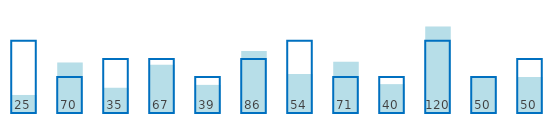
| Category | Valor real | Objetivo |
|---|---|---|
| Objetivo 1 | 25 | 100 |
| Objetivo2 | 70 | 50 |
| Objetivo 3 | 35 | 75 |
| Objetivo 4 | 67 | 75 |
| Objetivo 5 | 39 | 50 |
| Objetivo 6 | 86 | 75 |
| Objetivo 7 | 54 | 100 |
| Objetivo 8 | 71 | 50 |
| Objetivo 9 | 40 | 50 |
| Objetivo 10 | 120 | 100 |
| Objetivo 11 | 50 | 50 |
| Objetivo 12 | 50 | 75 |